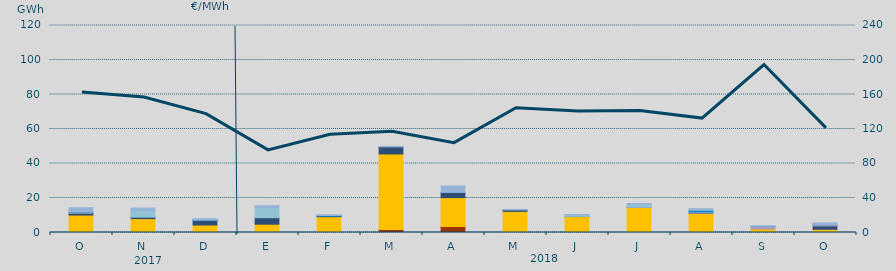
| Category | Carbón | Ciclo Combinado | Cogeneración | Consumo Bombeo | Enlace Península Baleares | Eólica | Hidráulica | Internacionales | Solar fotovoltaica | Turbinación bombeo |
|---|---|---|---|---|---|---|---|---|---|---|
| O | 0 | 10119.2 | 0 | 1038.2 | 495.2 | 0 | 208.4 | 0 | 0 | 2510.5 |
| N | 0 | 8034.3 | 0 | 863.8 | 0 | 0 | 0 | 3635.7 | 0 | 1650.6 |
| D | 374 | 3967.2 | 0 | 2746.1 | 58.6 | 0 | 52.1 | 0 | 0 | 774.9 |
| E | 0 | 4799.8 | 0 | 3776.1 | 0 | 0 | 0 | 5766.5 | 0 | 1181.9 |
| F | 0 | 9167.2 | 0 | 319.8 | 0 | 0 | 367.5 | 0 | 0 | 436 |
| M | 1806.7 | 43724.8 | 0 | 4108.1 | 0 | 0 | 0 | 0 | 0 | 249 |
| A | 3485.4 | 16735.1 | 0 | 3030.8 | 0 | 0 | 0 | 0 | 0 | 3717.6 |
| M | 0 | 12256.8 | 0 | 795.1 | 0 | 0 | 0 | 0 | 0 | 330.9 |
| J | 0 | 9234.9 | 0 | 91.5 | 0 | 0 | 0 | 976 | 0 | 107.7 |
| J | 92.3 | 14456.3 | 0 | 14.6 | 244 | 0 | 0 | 1458.3 | 0 | 560.7 |
| A | 291.3 | 10832 | 0 | 140.5 | 678 | 0 | 898.1 | 0 | 0 | 948.3 |
| S | 0 | 2035.7 | 0 | 0 | 1565.3 | 0 | 5 | 0 | 0 | 107.3 |
| O | 0 | 1903.4 | 7.4 | 1893.5 | 711 | 0 | 97 | 0 | 0 | 979 |